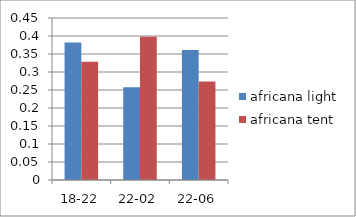
| Category | africana light | africana tent |
|---|---|---|
| 18-22 | 0.382 | 0.328 |
| 22-02 | 0.257 | 0.398 |
| 22-06 | 0.361 | 0.274 |